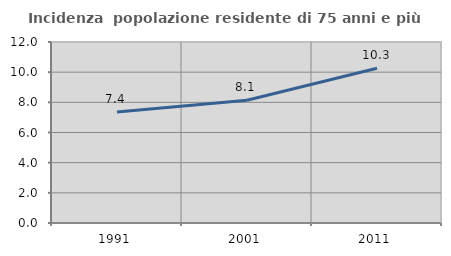
| Category | Incidenza  popolazione residente di 75 anni e più |
|---|---|
| 1991.0 | 7.36 |
| 2001.0 | 8.137 |
| 2011.0 | 10.263 |